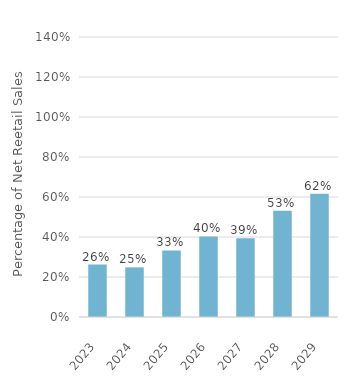
| Category | Percentage Clean Energy |
|---|---|
| 2023.0 | 0.262 |
| 2024.0 | 0.248 |
| 2025.0 | 0.333 |
| 2026.0 | 0.403 |
| 2027.0 | 0.394 |
| 2028.0 | 0.532 |
| 2029.0 | 0.617 |